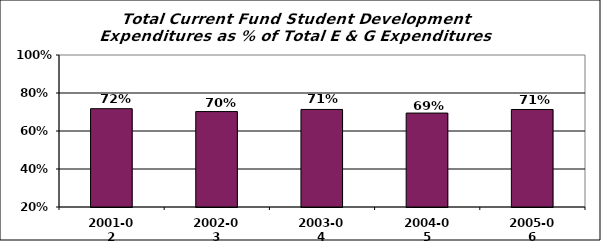
| Category | % of E & G |
|---|---|
| 2001-02 | 0.717 |
| 2002-03 | 0.702 |
| 2003-04 | 0.713 |
| 2004-05 | 0.694 |
| 2005-06 | 0.713 |